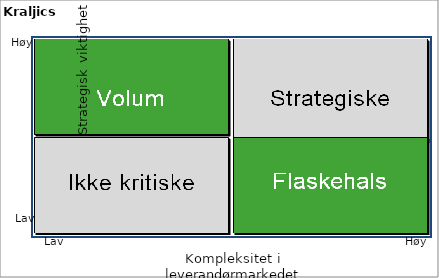
| Category | "Fyll inn navn" |
|---|---|
| 1.0 | 1 |